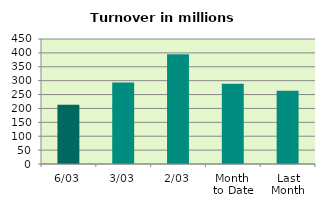
| Category | Series 0 |
|---|---|
| 6/03 | 213.014 |
| 3/03 | 293.827 |
| 2/03 | 395.293 |
| Month 
to Date | 289.237 |
| Last
Month | 263.32 |